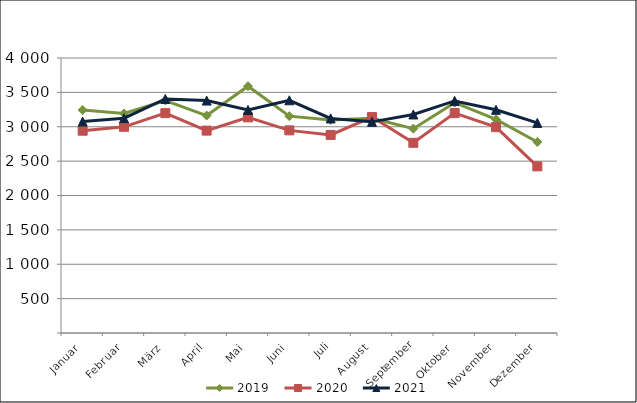
| Category | 2019 | 2020 | 2021 |
|---|---|---|---|
| Januar | 3242.771 | 2942.307 | 3075.869 |
| Februar | 3193.738 | 2998.615 | 3124.63 |
| März | 3381.862 | 3197.894 | 3403.806 |
| April | 3163.06 | 2943.993 | 3380.786 |
| Mai | 3589.861 | 3136.379 | 3243.564 |
| Juni | 3153.911 | 2947.316 | 3385.115 |
| Juli | 3098.941 | 2880.691 | 3121.39 |
| August | 3122.439 | 3141.316 | 3071.147 |
| September | 2972.414 | 2766.388 | 3178.618 |
| Oktober | 3351.167 | 3198.25 | 3375.594 |
| November | 3107.012 | 2994.741 | 3247.026 |
| Dezember | 2778.828 | 2423.492 | 3055.864 |